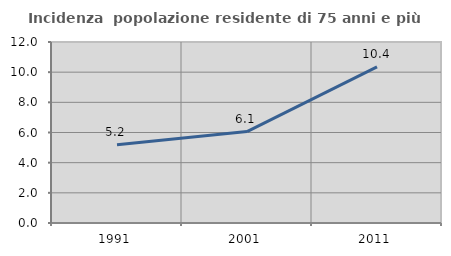
| Category | Incidenza  popolazione residente di 75 anni e più |
|---|---|
| 1991.0 | 5.189 |
| 2001.0 | 6.063 |
| 2011.0 | 10.351 |